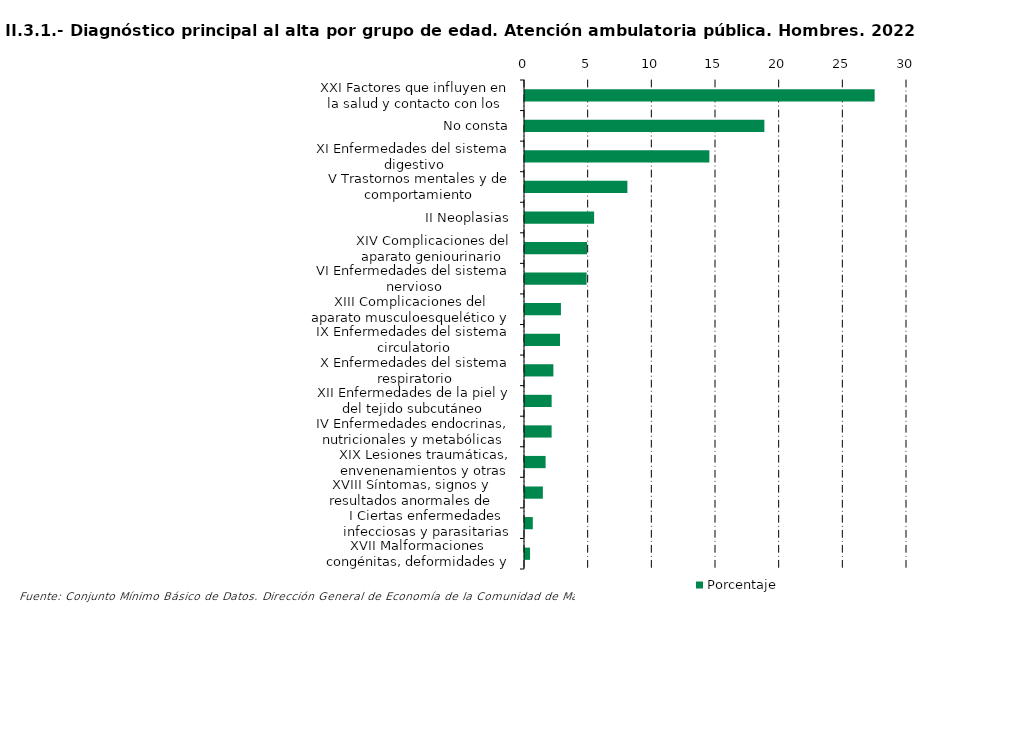
| Category | Porcentaje |
|---|---|
| XXI Factores que influyen en la salud y contacto con los servicios sanitarios | 27.46 |
| No consta | 18.8 |
| XI Enfermedades del sistema digestivo | 14.478 |
| V Trastornos mentales y de comportamiento | 8.041 |
| II Neoplasias | 5.429 |
| XIV Complicaciones del aparato geniourinario | 4.872 |
| VI Enfermedades del sistema nervioso | 4.837 |
| XIII Complicaciones del aparato musculoesquelético y del tejido conectivo | 2.822 |
| IX Enfermedades del sistema circulatorio | 2.748 |
| X Enfermedades del sistema respiratorio | 2.229 |
| XII Enfermedades de la piel y del tejido subcutáneo | 2.092 |
| IV Enfermedades endocrinas, nutricionales y metabólicas | 2.091 |
| XIX Lesiones traumáticas, envenenamientos y otras consecuencias de causas externas | 1.617 |
| XVIII Síntomas, signos y resultados anormales de pruebas complementarias, no clasificados bajo otro concepto | 1.403 |
| I Ciertas enfermedades infecciosas y parasitarias | 0.613 |
| XVII Malformaciones congénitas, deformidades y anomalías cromosómicas | 0.397 |